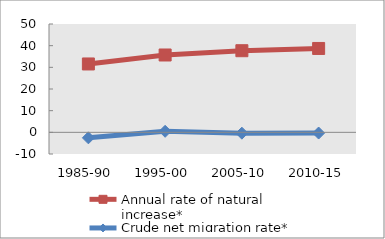
| Category | Annual rate of natural increase* | Crude net migration rate* |
|---|---|---|
| 1985-90 | 31.554 | -2.543 |
| 1995-00 | 35.694 | 0.477 |
| 2005-10 | 37.671 | -0.392 |
| 2010-15 | 38.713 | -0.324 |